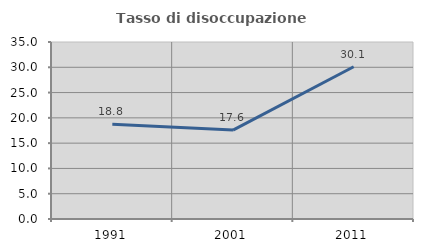
| Category | Tasso di disoccupazione giovanile  |
|---|---|
| 1991.0 | 18.75 |
| 2001.0 | 17.585 |
| 2011.0 | 30.104 |